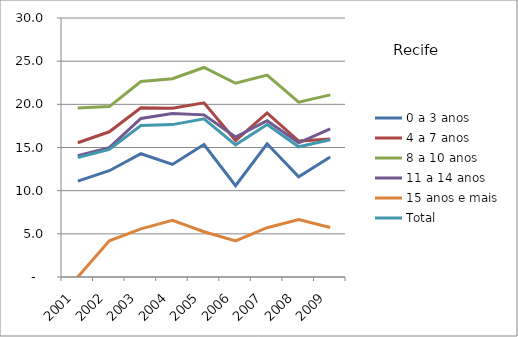
| Category | 0 a 3 anos | 4 a 7 anos | 8 a 10 anos | 11 a 14 anos | 15 anos e mais | Total |
|---|---|---|---|---|---|---|
| 2001.0 | 11.1 | 15.55 | 19.57 | 14.05 | 0 | 13.85 |
| 2002.0 | 12.31 | 16.82 | 19.74 | 14.99 | 4.19 | 14.78 |
| 2003.0 | 14.28 | 19.61 | 22.65 | 18.37 | 5.57 | 17.54 |
| 2004.0 | 13.04 | 19.56 | 22.97 | 18.94 | 6.56 | 17.65 |
| 2005.0 | 15.35 | 20.18 | 24.27 | 18.78 | 5.24 | 18.33 |
| 2006.0 | 10.58 | 15.81 | 22.44 | 16.22 | 4.19 | 15.31 |
| 2007.0 | 15.43 | 19 | 23.39 | 18.11 | 5.71 | 17.67 |
| 2008.0 | 11.61 | 15.74 | 20.25 | 15.55 | 6.65 | 15.08 |
| 2009.0 | 13.91 | 15.98 | 21.1 | 17.15 | 5.74 | 15.89 |